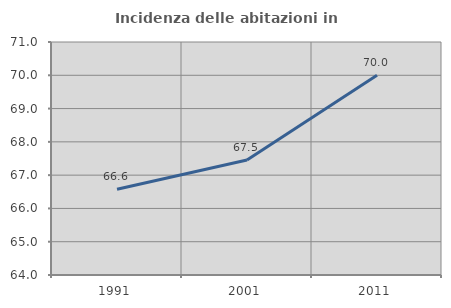
| Category | Incidenza delle abitazioni in proprietà  |
|---|---|
| 1991.0 | 66.577 |
| 2001.0 | 67.454 |
| 2011.0 | 70.003 |